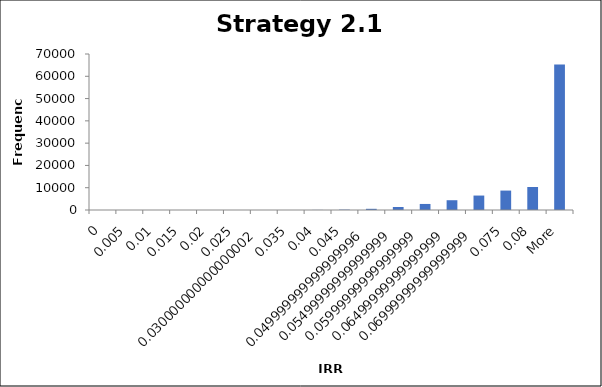
| Category | Frequency |
|---|---|
| 0 | 0 |
| 0.005 | 0 |
| 0.01 | 0 |
| 0.015 | 1 |
| 0.02 | 0 |
| 0.025 | 0 |
| 0.03 | 2 |
| 0.035 | 3 |
| 0.04 | 42 |
| 0.045 | 161 |
| 0.05 | 534 |
| 0.055 | 1358 |
| 0.06 | 2715 |
| 0.065 | 4388 |
| 0.07 | 6482 |
| 0.075 | 8717 |
| 0.08 | 10318 |
| More | 65281 |